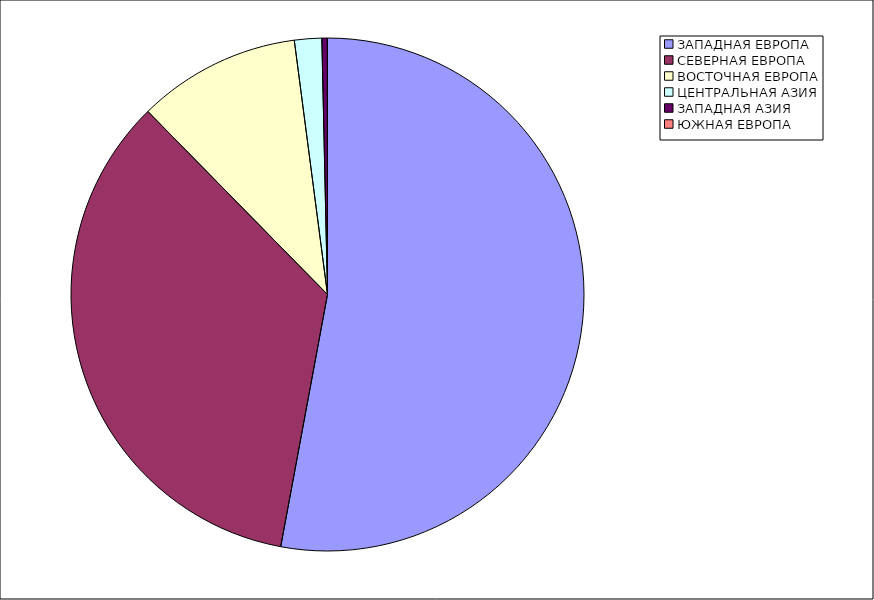
| Category | Оборот |
|---|---|
| ЗАПАДНАЯ ЕВРОПА | 52.921 |
| СЕВЕРНАЯ ЕВРОПА | 34.73 |
| ВОСТОЧНАЯ ЕВРОПА | 10.281 |
| ЦЕНТРАЛЬНАЯ АЗИЯ | 1.717 |
| ЗАПАДНАЯ АЗИЯ | 0.344 |
| ЮЖНАЯ ЕВРОПА | 0.008 |